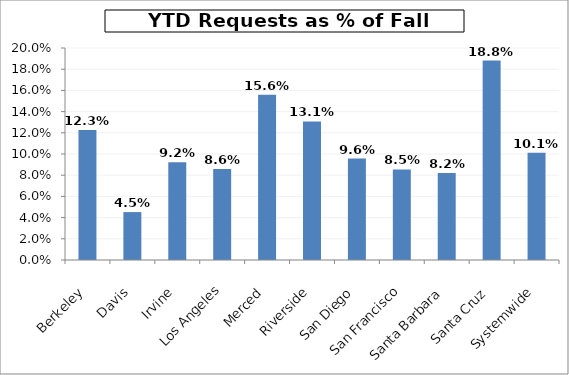
| Category | Series 0 |
|---|---|
| Berkeley | 0.123 |
| Davis | 0.045 |
| Irvine | 0.092 |
| Los Angeles | 0.086 |
| Merced | 0.156 |
| Riverside | 0.131 |
| San Diego | 0.096 |
| San Francisco | 0.085 |
| Santa Barbara | 0.082 |
| Santa Cruz | 0.188 |
| Systemwide | 0.101 |